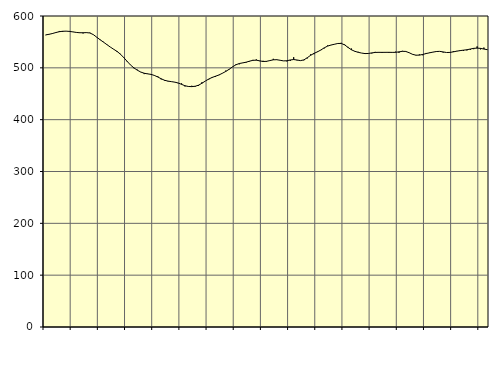
| Category | Piggar | Series 1 |
|---|---|---|
| nan | 563 | 563.58 |
| 87.0 | 565.1 | 564.72 |
| 87.0 | 565.5 | 566.22 |
| 87.0 | 567.5 | 568.09 |
| nan | 571.1 | 569.68 |
| 88.0 | 569.2 | 570.53 |
| 88.0 | 570.7 | 570.74 |
| 88.0 | 571.1 | 570.26 |
| nan | 569.1 | 569.36 |
| 89.0 | 568.6 | 568.34 |
| 89.0 | 568.3 | 567.7 |
| 89.0 | 566.3 | 567.71 |
| nan | 568.4 | 567.95 |
| 90.0 | 567.9 | 567.22 |
| 90.0 | 564.4 | 564.16 |
| 90.0 | 558.9 | 559.25 |
| nan | 553.6 | 554.25 |
| 91.0 | 550.2 | 549.6 |
| 91.0 | 545.5 | 544.87 |
| 91.0 | 540.1 | 540.17 |
| nan | 536.1 | 535.91 |
| 92.0 | 530.5 | 531.68 |
| 92.0 | 527 | 526.33 |
| 92.0 | 520.4 | 519.63 |
| nan | 511.3 | 512.28 |
| 93.0 | 505.6 | 505.3 |
| 93.0 | 499.1 | 499.74 |
| 93.0 | 496.4 | 495.35 |
| nan | 491.6 | 491.84 |
| 94.0 | 487.9 | 489.57 |
| 94.0 | 488.9 | 488.36 |
| 94.0 | 487.1 | 487.36 |
| nan | 484.8 | 485.33 |
| 95.0 | 483.7 | 482.29 |
| 95.0 | 477.7 | 478.91 |
| 95.0 | 475.1 | 476 |
| nan | 473.9 | 474.36 |
| 96.0 | 473.2 | 473.39 |
| 96.0 | 472.1 | 472.38 |
| 96.0 | 470.3 | 470.75 |
| nan | 470 | 468.12 |
| 97.0 | 464.1 | 465.45 |
| 97.0 | 463.6 | 464.02 |
| 97.0 | 465.4 | 463.77 |
| nan | 463.5 | 464.46 |
| 98.0 | 465.1 | 466.51 |
| 98.0 | 472.2 | 470.24 |
| 98.0 | 474.5 | 474.53 |
| nan | 477.5 | 478.4 |
| 99.0 | 482.3 | 481.45 |
| 99.0 | 482.5 | 483.8 |
| 99.0 | 485.9 | 486.26 |
| nan | 489.7 | 489.46 |
| 0.0 | 494.7 | 493 |
| 0.0 | 496.5 | 497.19 |
| 0.0 | 502.2 | 501.86 |
| nan | 506.8 | 505.86 |
| 1.0 | 506.8 | 508.33 |
| 1.0 | 509.3 | 509.55 |
| 1.0 | 510.1 | 510.87 |
| nan | 512.2 | 512.83 |
| 2.0 | 515.3 | 514.49 |
| 2.0 | 516.2 | 514.75 |
| 2.0 | 512.9 | 513.49 |
| nan | 513.6 | 512.19 |
| 3.0 | 511.7 | 512.54 |
| 3.0 | 513.9 | 514.02 |
| 3.0 | 517.4 | 515.45 |
| nan | 515.1 | 515.68 |
| 4.0 | 514.6 | 514.58 |
| 4.0 | 513.5 | 513.42 |
| 4.0 | 512.4 | 513.65 |
| nan | 513.4 | 515.19 |
| 5.0 | 520.5 | 515.99 |
| 5.0 | 514.4 | 515.09 |
| 5.0 | 513.7 | 513.91 |
| nan | 514.5 | 515.3 |
| 6.0 | 518.1 | 519.48 |
| 6.0 | 526 | 524.19 |
| 6.0 | 526.3 | 527.93 |
| nan | 531.6 | 530.85 |
| 7.0 | 534.1 | 534.42 |
| 7.0 | 537.5 | 538.6 |
| 7.0 | 543.2 | 541.97 |
| nan | 543.9 | 544.02 |
| 8.0 | 545.2 | 545.47 |
| 8.0 | 547.2 | 546.99 |
| 8.0 | 548.3 | 547.06 |
| nan | 545.2 | 544.32 |
| 9.0 | 540.4 | 539.35 |
| 9.0 | 537.2 | 534.84 |
| 9.0 | 531.4 | 531.88 |
| nan | 530.9 | 529.93 |
| 10.0 | 528.5 | 528.48 |
| 10.0 | 527.9 | 527.51 |
| 10.0 | 527.2 | 527.7 |
| nan | 527.8 | 528.82 |
| 11.0 | 530.8 | 529.69 |
| 11.0 | 529.2 | 529.9 |
| 11.0 | 529.1 | 529.84 |
| nan | 529.2 | 529.9 |
| 12.0 | 528.9 | 529.92 |
| 12.0 | 529.5 | 529.8 |
| 12.0 | 531.2 | 529.91 |
| nan | 528.9 | 530.79 |
| 13.0 | 532.7 | 531.89 |
| 13.0 | 531 | 531.63 |
| 13.0 | 529.4 | 529.13 |
| nan | 525.7 | 526.04 |
| 14.0 | 524 | 524.4 |
| 14.0 | 525.9 | 524.5 |
| 14.0 | 524.2 | 525.87 |
| nan | 528.7 | 527.55 |
| 15.0 | 529.5 | 528.97 |
| 15.0 | 530.2 | 530.31 |
| 15.0 | 532 | 531.46 |
| nan | 531.8 | 531.76 |
| 16.0 | 529.5 | 530.67 |
| 16.0 | 529.6 | 529.57 |
| 16.0 | 529.4 | 529.73 |
| nan | 532.3 | 530.84 |
| 17.0 | 532.6 | 532.12 |
| 17.0 | 533.9 | 533.2 |
| 17.0 | 532.6 | 534.09 |
| nan | 533.6 | 534.9 |
| 18.0 | 534.7 | 536.28 |
| 18.0 | 536 | 537.6 |
| 18.0 | 541.3 | 538.03 |
| nan | 535.6 | 537.52 |
| 19.0 | 539.1 | 536.27 |
| 19.0 | 534.4 | 534.99 |